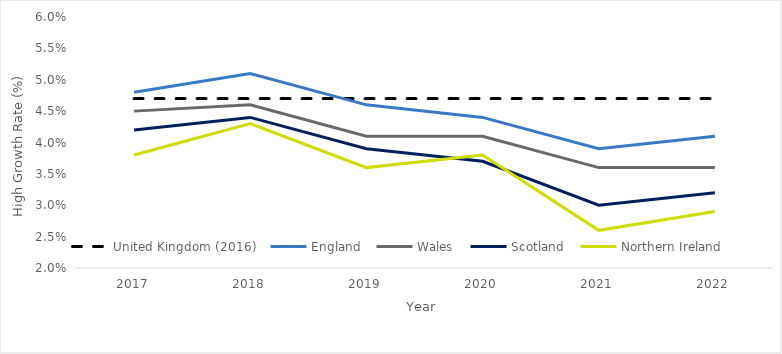
| Category | United Kingdom (2016) | England | Wales | Scotland | Northern Ireland |
|---|---|---|---|---|---|
| 2017.0 | 0.047 | 0.048 | 0.045 | 0.042 | 0.038 |
| 2018.0 | 0.047 | 0.051 | 0.046 | 0.044 | 0.043 |
| 2019.0 | 0.047 | 0.046 | 0.041 | 0.039 | 0.036 |
| 2020.0 | 0.047 | 0.044 | 0.041 | 0.037 | 0.038 |
| 2021.0 | 0.047 | 0.039 | 0.036 | 0.03 | 0.026 |
| 2022.0 | 0.047 | 0.041 | 0.036 | 0.032 | 0.029 |